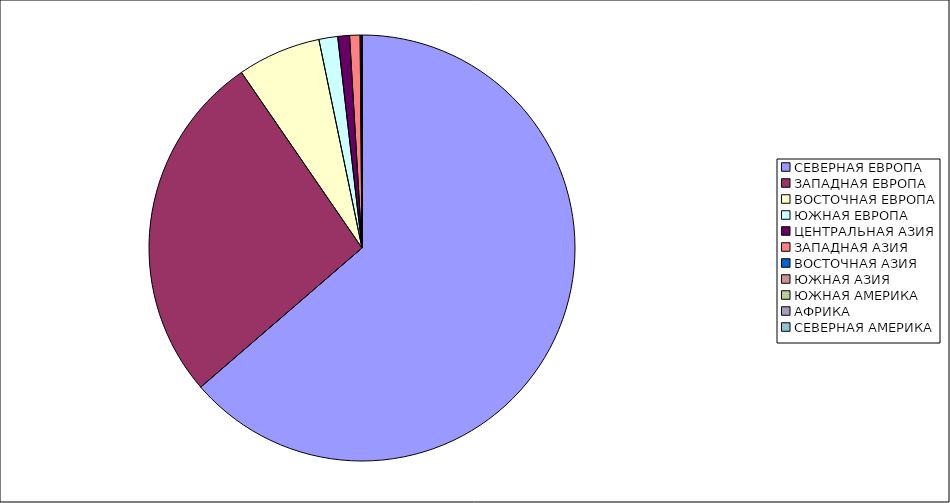
| Category | Оборот |
|---|---|
| СЕВЕРНАЯ ЕВРОПА | 63.67 |
| ЗАПАДНАЯ ЕВРОПА | 26.752 |
| ВОСТОЧНАЯ ЕВРОПА | 6.331 |
| ЮЖНАЯ ЕВРОПА | 1.422 |
| ЦЕНТРАЛЬНАЯ АЗИЯ | 0.892 |
| ЗАПАДНАЯ АЗИЯ | 0.793 |
| ВОСТОЧНАЯ АЗИЯ | 0.098 |
| ЮЖНАЯ АЗИЯ | 0.012 |
| ЮЖНАЯ АМЕРИКА | 0.011 |
| АФРИКА | 0.011 |
| СЕВЕРНАЯ АМЕРИКА | 0.008 |